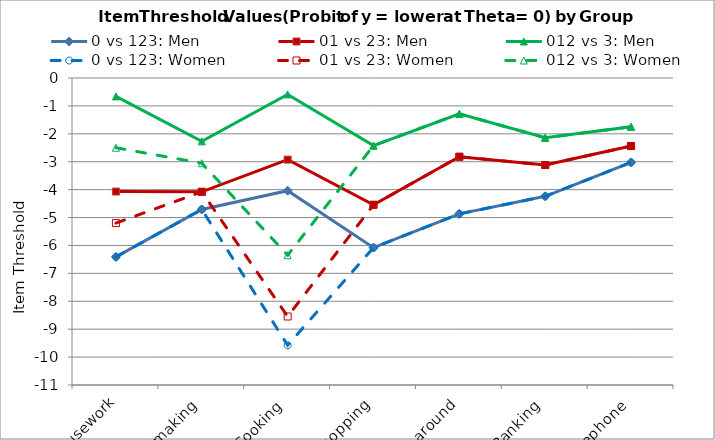
| Category | 0 vs 123: Men | 01 vs 23: Men | 012 vs 3: Men | 0 vs 123: Women | 01 vs 23: Women | 012 vs 3: Women |
|---|---|---|---|---|---|---|
| 1. Housework | -6.411 | -4.068 | -0.66 | -6.411 | -5.198 | -2.499 |
| 2. Bedmaking | -4.709 | -4.078 | -2.268 | -4.709 | -4.078 | -3.053 |
| 3. Cooking | -4.037 | -2.924 | -0.588 | -9.576 | -8.545 | -6.349 |
| 4. Shopping | -6.079 | -4.544 | -2.423 | -6.079 | -4.544 | -2.423 |
| 5. Getting around | -4.868 | -2.822 | -1.284 | -4.868 | -2.822 | -1.284 |
| 6. Banking | -4.24 | -3.117 | -2.143 | -4.24 | -3.117 | -2.143 |
| 7. Telephone | -3.024 | -2.438 | -1.747 | -3.024 | -2.438 | -1.747 |